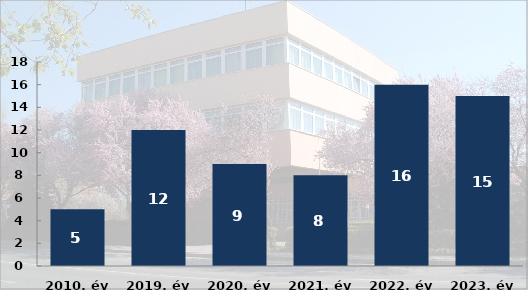
| Category | Könnyen sérült személyek száma (fő) |
|---|---|
| 2010. év | 5 |
| 2019. év | 12 |
| 2020. év | 9 |
| 2021. év | 8 |
| 2022. év | 16 |
| 2023. év | 15 |